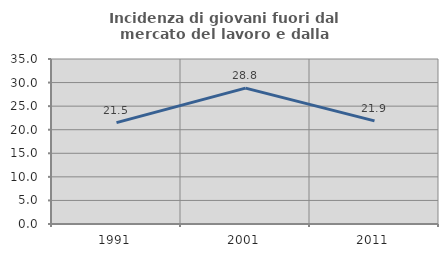
| Category | Incidenza di giovani fuori dal mercato del lavoro e dalla formazione  |
|---|---|
| 1991.0 | 21.504 |
| 2001.0 | 28.83 |
| 2011.0 | 21.865 |